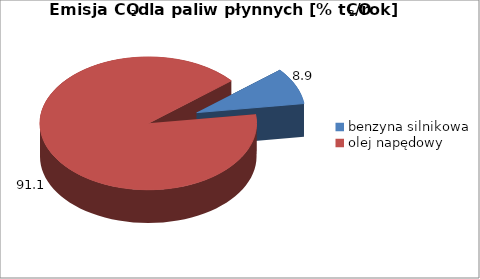
| Category | benzyna silnikowa olej napędowy |
|---|---|
| benzyna silnikowa | 8.93 |
| olej napędowy | 91.07 |